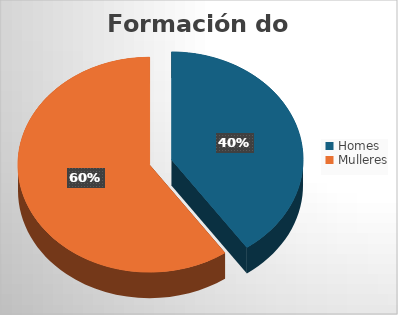
| Category | Formación do CPFP |
|---|---|
| Homes | 259 |
| Mulleres | 384 |